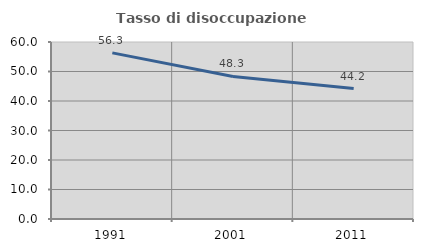
| Category | Tasso di disoccupazione giovanile  |
|---|---|
| 1991.0 | 56.322 |
| 2001.0 | 48.333 |
| 2011.0 | 44.231 |